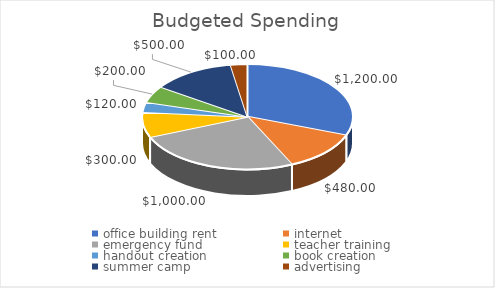
| Category | Series 0 |
|---|---|
| office building rent | 1200 |
| internet | 480 |
| emergency fund | 1000 |
| teacher training | 300 |
| handout creation | 120 |
| book creation | 200 |
| summer camp | 500 |
| advertising | 100 |